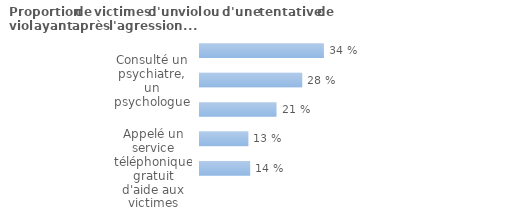
| Category | Series 0 |
|---|---|
| Appelé un service téléphonique gratuit d'aide aux victimes | 0.137 |
| Rencontré des membres d'une association d'aide aux victimes | 0.132 |
| Parlé de leur situation avec les services sociaux | 0.208 |
| Consulté un psychiatre, un psychologue | 0.278 |
| Été vues par un médecin | 0.337 |